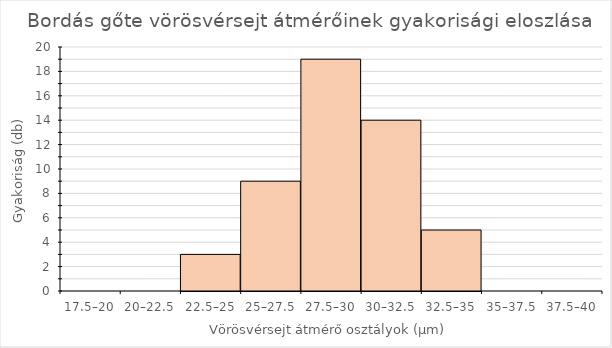
| Category | bordás gőte VVS |
|---|---|
| 17.5–20 | 0 |
| 20–22.5 | 0 |
| 22.5–25 | 3 |
| 25–27.5 | 9 |
| 27.5–30 | 19 |
| 30–32.5 | 14 |
| 32.5–35 | 5 |
| 35–37.5 | 0 |
| 37.5–40 | 0 |